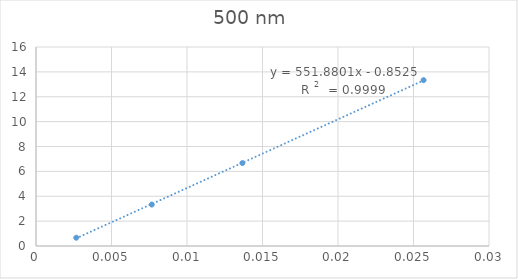
| Category | Series 0 |
|---|---|
| 0.0026666666666666644 | 0.667 |
| 0.007666666666666665 | 3.333 |
| 0.013666666666666667 | 6.667 |
| 0.025666666666666664 | 13.333 |